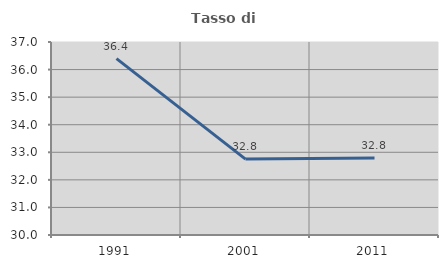
| Category | Tasso di occupazione   |
|---|---|
| 1991.0 | 36.397 |
| 2001.0 | 32.753 |
| 2011.0 | 32.795 |